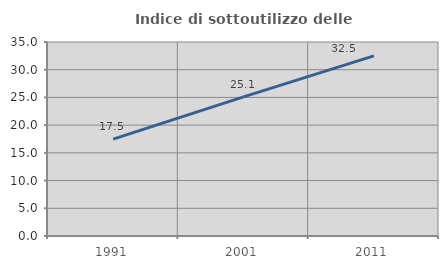
| Category | Indice di sottoutilizzo delle abitazioni  |
|---|---|
| 1991.0 | 17.48 |
| 2001.0 | 25.096 |
| 2011.0 | 32.496 |